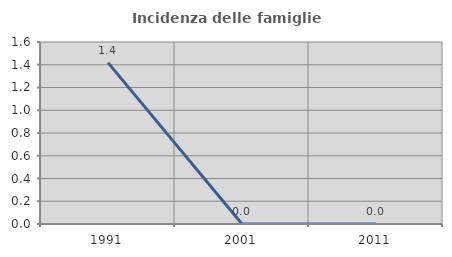
| Category | Incidenza delle famiglie numerose |
|---|---|
| 1991.0 | 1.418 |
| 2001.0 | 0 |
| 2011.0 | 0 |